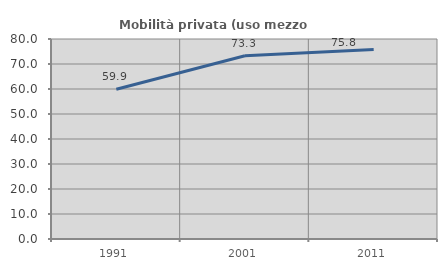
| Category | Mobilità privata (uso mezzo privato) |
|---|---|
| 1991.0 | 59.93 |
| 2001.0 | 73.294 |
| 2011.0 | 75.757 |